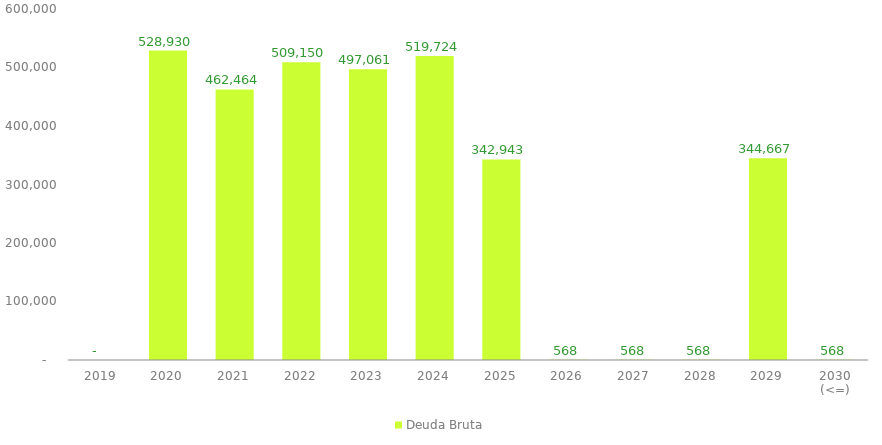
| Category | Deuda Bruta |
|---|---|
| 2019 | 0 |
| 2020 | 528930.169 |
| 2021 | 462463.946 |
| 2022 | 509150.223 |
| 2023 | 497060.766 |
| 2024 | 519723.938 |
| 2025 | 342943.053 |
| 2026 | 567.533 |
| 2027 | 567.533 |
| 2028 | 567.533 |
| 2029 | 344667.233 |
| 2030 (<=) | 567.533 |